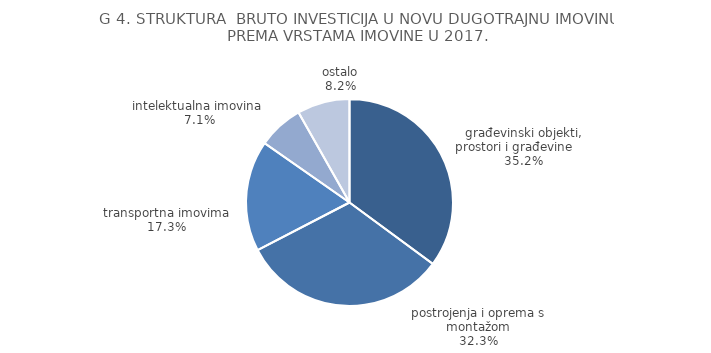
| Category | Series 0 |
|---|---|
| građevinski objekti, prostori i građevine      | 35.1 |
| postrojenja i oprema s montažom | 32.3 |
| transportna imovima | 17.3 |
| intelektualna imovina  | 7.1 |
| ostalo | 8.2 |